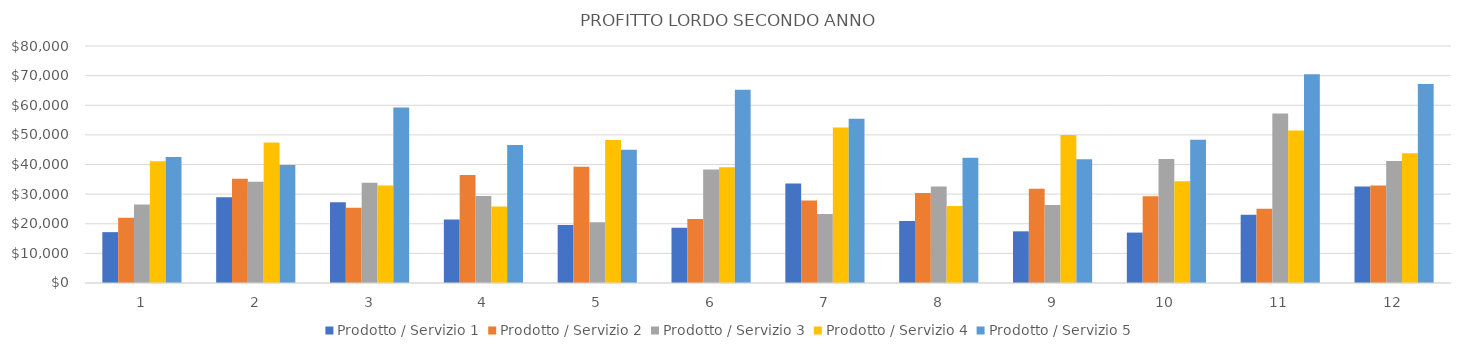
| Category | Prodotto / Servizio 1 | Prodotto / Servizio 2 | Prodotto / Servizio 3 | Prodotto / Servizio 4 | Prodotto / Servizio 5 |
|---|---|---|---|---|---|
| 0 | 17167.8 | 21992.6 | 26467 | 41126.4 | 42546 |
| 1 | 28975.1 | 35202.65 | 34178.4 | 47385.9 | 39830 |
| 2 | 27264 | 25397.75 | 33852 | 32945 | 59276 |
| 3 | 21413.6 | 36433.8 | 29356.6 | 25861.5 | 46578 |
| 4 | 19574.7 | 39261.6 | 20536 | 48289.5 | 45010 |
| 5 | 18637.5 | 21563.4 | 38322 | 39049.5 | 65212 |
| 6 | 33575.9 | 27828.85 | 23328 | 52448 | 55468 |
| 7 | 20959.2 | 30360 | 32580 | 26026 | 42238 |
| 8 | 17437.6 | 31848 | 26289 | 49962 | 41748 |
| 9 | 17017 | 29310.05 | 41841 | 34386 | 48356 |
| 10 | 23032.1 | 25074.75 | 57220.9 | 51454 | 70490 |
| 11 | 32578 | 32910 | 41140 | 43836 | 67192 |